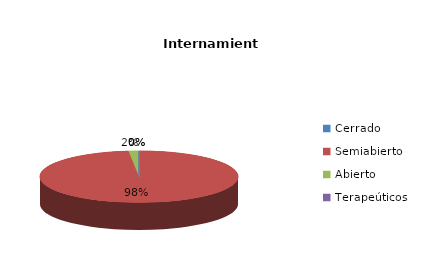
| Category | Series 0 |
|---|---|
| Cerrado | 0 |
| Semiabierto | 58 |
| Abierto | 1 |
| Terapeúticos | 0 |